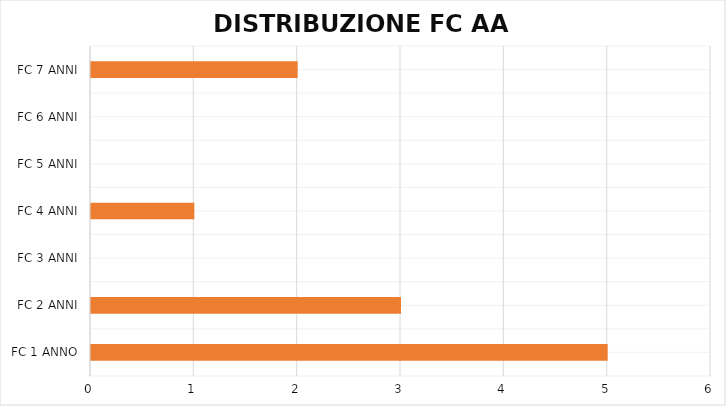
| Category | Series 0 |
|---|---|
| FC 1 ANNO | 5 |
| FC 2 ANNI | 3 |
| FC 3 ANNI | 0 |
| FC 4 ANNI | 1 |
| FC 5 ANNI | 0 |
| FC 6 ANNI | 0 |
| FC 7 ANNI | 2 |